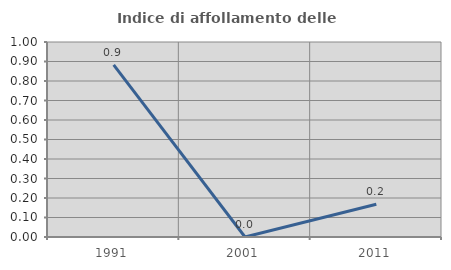
| Category | Indice di affollamento delle abitazioni  |
|---|---|
| 1991.0 | 0.882 |
| 2001.0 | 0 |
| 2011.0 | 0.168 |